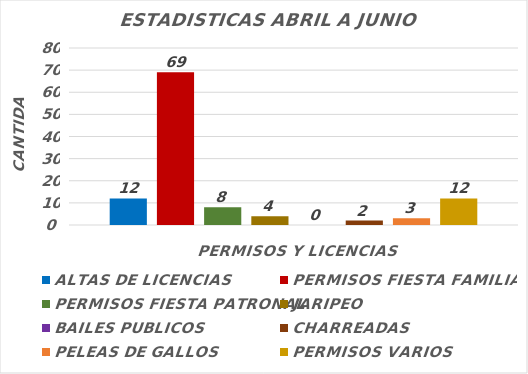
| Category | ALTAS DE LICENCIAS | PERMISOS FIESTA FAMILIAR | PERMISOS FIESTA PATRONAL | JARIPEO | BAILES PUBLICOS | CHARREADAS | PELEAS DE GALLOS | PERMISOS VARIOS |
|---|---|---|---|---|---|---|---|---|
| 0 | 12 | 69 | 8 | 4 | 0 | 2 | 3 | 12 |